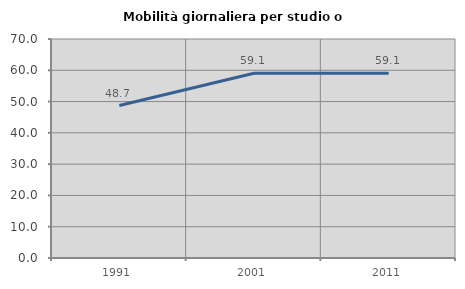
| Category | Mobilità giornaliera per studio o lavoro |
|---|---|
| 1991.0 | 48.723 |
| 2001.0 | 59.065 |
| 2011.0 | 59.074 |